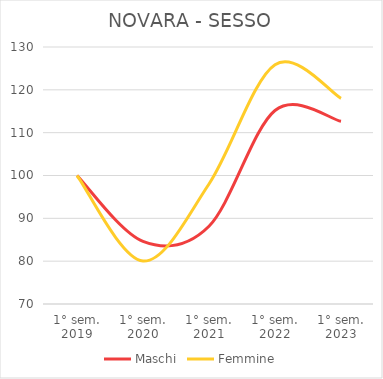
| Category | Maschi | Femmine |
|---|---|---|
| 1° sem.
2019 | 100 | 100 |
| 1° sem.
2020 | 84.629 | 80.033 |
| 1° sem.
2021 | 88.162 | 98.023 |
| 1° sem.
2022 | 115.168 | 125.855 |
| 1° sem.
2023 | 112.649 | 118.012 |